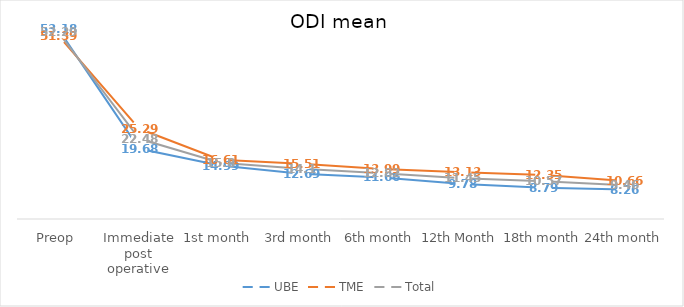
| Category | UBE | TME | Total |
|---|---|---|---|
| Preop | 53.18 | 51.39 | 52.29 |
| Immediate post operative | 19.68 | 25.29 | 22.48 |
| 1st month | 14.99 | 16.61 | 15.8 |
| 3rd month | 12.69 | 15.51 | 14.1 |
| 6th month | 11.66 | 13.99 | 12.82 |
| 12th Month | 9.78 | 13.13 | 11.45 |
| 18th month | 8.79 | 12.35 | 10.57 |
| 24th month | 8.26 | 10.66 | 9.46 |